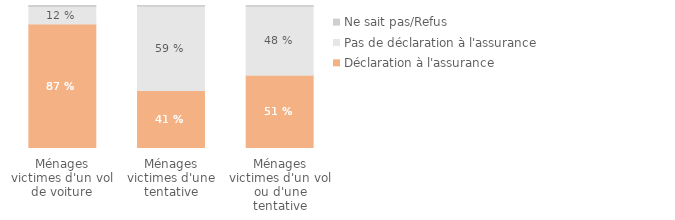
| Category | Déclaration à l'assurance | Pas de déclaration à l'assurance | Ne sait pas/Refus |
|---|---|---|---|
| Ménages victimes d'un vol ou d'une tentative | 0.512 | 0.483 | 0.005 |
| Ménages victimes d'une tentative | 0.406 | 0.589 | 0.005 |
| Ménages victimes d'un vol de voiture | 0.871 | 0.122 | 0.006 |